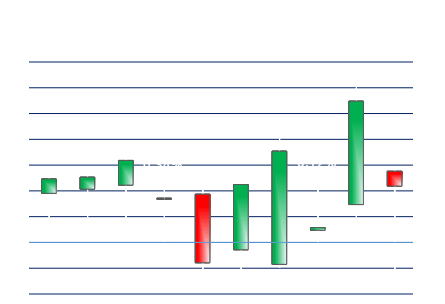
| Category | Series 0 | Series 1 | Series 2 | Series 3 |
|---|---|---|---|---|
| YMZ19 | 0.004 | 0.006 | 0 | 0.005 |
| EPZ19 | 0.004 | 0.006 | 0 | 0.005 |
| ENQZ19 | 0.004 | 0.007 | 0.001 | 0.006 |
| EMDZ19 | 0.003 | 0.005 | 0 | 0.003 |
| RTYZ19 | 0.004 | 0.006 | -0.003 | -0.002 |
| DDZ19 | -0.001 | 0.006 | -0.002 | 0.004 |
| DSXZ19 | -0.002 | 0.008 | -0.002 | 0.007 |
| QFAZ19 | 0.001 | 0.005 | 0 | 0.001 |
| PILV19 | 0.003 | 0.012 | 0.002 | 0.011 |
| NKDZ19 | 0.006 | 0.006 | -0.002 | 0.004 |